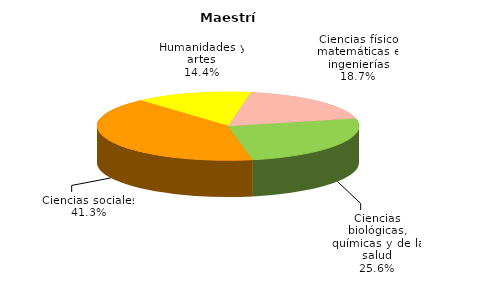
| Category | Series 0 |
|---|---|
| Ciencias físico matemáticas e ingenierías | 1967 |
| Ciencias biológicas, químicas y de la salud | 2692 |
| Ciencias sociales | 4353 |
| Humanidades y artes | 1518 |